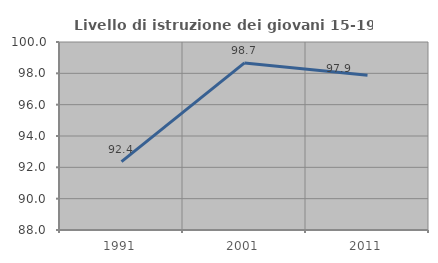
| Category | Livello di istruzione dei giovani 15-19 anni |
|---|---|
| 1991.0 | 92.366 |
| 2001.0 | 98.667 |
| 2011.0 | 97.872 |